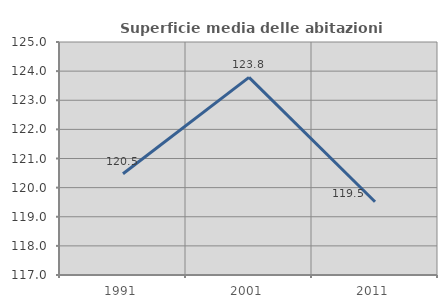
| Category | Superficie media delle abitazioni occupate |
|---|---|
| 1991.0 | 120.476 |
| 2001.0 | 123.787 |
| 2011.0 | 119.513 |